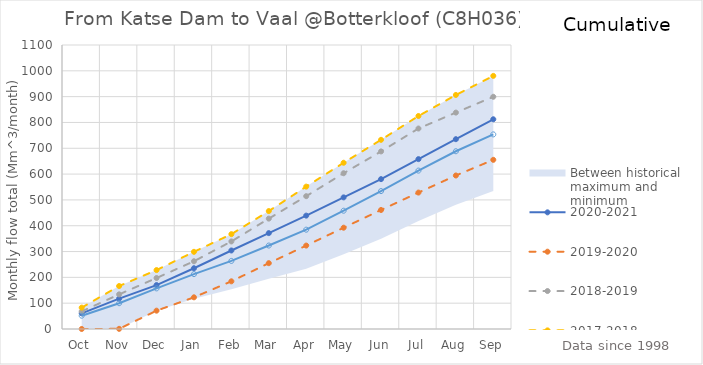
| Category | 2020-2021 | 2019-2020 | 2018-2019 | 2017-2018 | Mean total series |
|---|---|---|---|---|---|
| Oct | 60.643 | 0.107 | 68.136 | 82.859 | 51.479 |
| Nov | 117.417 | 0.615 | 134.111 | 166.432 | 99.886 |
| Dec | 170.172 | 71.017 | 197.522 | 228.227 | 157.352 |
| Jan | 235.342 | 122.733 | 262.399 | 298.903 | 212.59 |
| Feb | 304.107 | 184.652 | 339.156 | 367.37 | 263.657 |
| Mar | 371.398 | 254.973 | 427.5 | 456.731 | 323.288 |
| Apr | 439.147 | 323.139 | 514.48 | 551.477 | 384.722 |
| May | 509.779 | 392.376 | 603.307 | 643.942 | 458.153 |
| Jun | 580.469 | 460.992 | 687.803 | 732.755 | 534.188 |
| Jul | 658.016 | 528.446 | 776.475 | 825.004 | 613.542 |
| Aug | 735.236 | 594.565 | 838.18 | 906.496 | 688.515 |
| Sep | 812.294 | 655.245 | 899.451 | 980.401 | 753.757 |